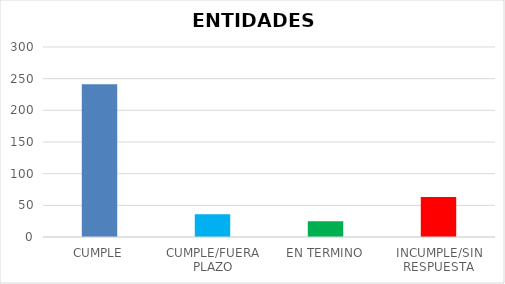
| Category | TOTAL |
|---|---|
| CUMPLE | 241 |
| CUMPLE/FUERA PLAZO | 36 |
| EN TERMINO | 25 |
| INCUMPLE/SIN RESPUESTA | 63 |